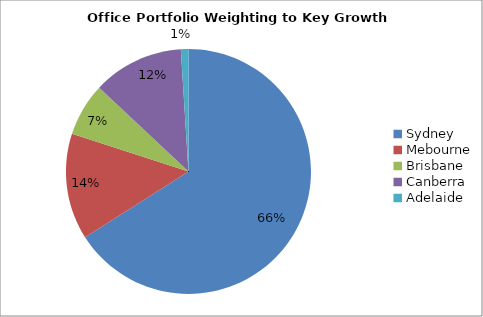
| Category | Series 0 |
|---|---|
| Sydney | 0.66 |
| Mebourne | 0.14 |
| Brisbane | 0.07 |
| Canberra | 0.12 |
| Adelaide | 0.01 |